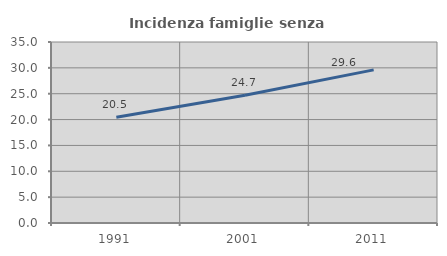
| Category | Incidenza famiglie senza nuclei |
|---|---|
| 1991.0 | 20.46 |
| 2001.0 | 24.705 |
| 2011.0 | 29.608 |